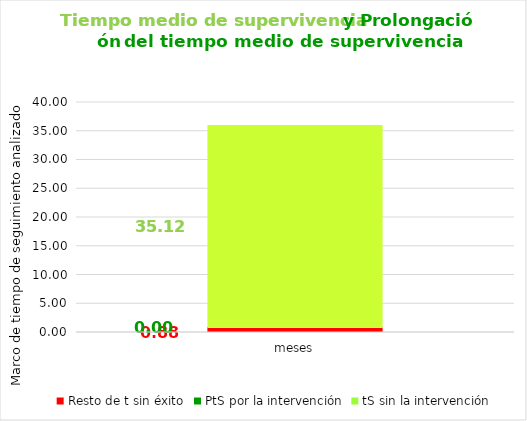
| Category | Resto de t sin éxito | PtS por la intervención | tS sin la intervención |
|---|---|---|---|
| meses | 0.877 | 0 | 35.123 |